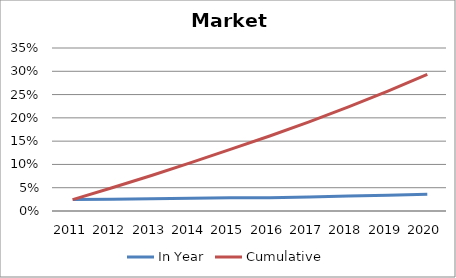
| Category | In Year | Cumulative |
|---|---|---|
| 2011.0 | 0.024 | 0.024 |
| 2012.0 | 0.025 | 0.05 |
| 2013.0 | 0.026 | 0.076 |
| 2014.0 | 0.027 | 0.104 |
| 2015.0 | 0.029 | 0.132 |
| 2016.0 | 0.029 | 0.161 |
| 2017.0 | 0.03 | 0.191 |
| 2018.0 | 0.032 | 0.223 |
| 2019.0 | 0.034 | 0.257 |
| 2020.0 | 0.036 | 0.294 |